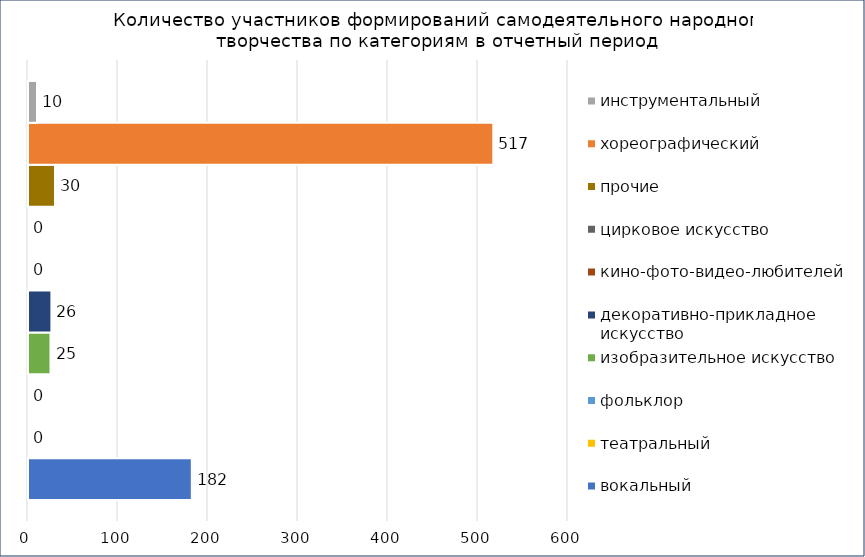
| Category | вокальный | театральный | фольклор | изобразительное искусство | декоративно-прикладное искусство | кино-фото-видео-любителей | цирковое искусство | прочие | хореографический | инструментальный |
|---|---|---|---|---|---|---|---|---|---|---|
| 0 | 182 | 0 | 0 | 25 | 26 | 0 | 0 | 30 | 517 | 10 |